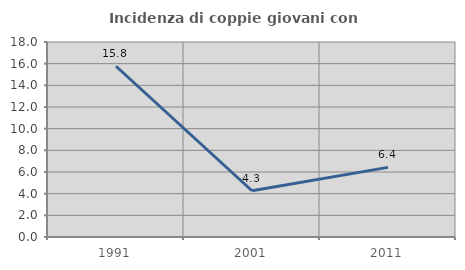
| Category | Incidenza di coppie giovani con figli |
|---|---|
| 1991.0 | 15.761 |
| 2001.0 | 4.268 |
| 2011.0 | 6.429 |